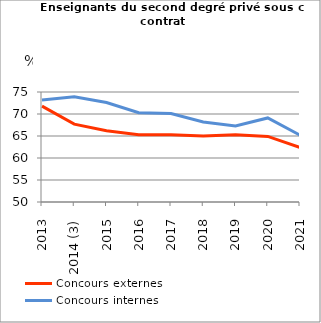
| Category | Concours externes  | Concours internes |
|---|---|---|
| 2013 | 71.8 | 73.2 |
| 2014 (3) | 67.7 | 73.9 |
| 2015 | 66.2 | 72.6 |
| 2016 | 65.3 | 70.3 |
| 2017 | 65.3 | 70.1 |
| 2018 | 65 | 68.2 |
| 2019 | 65.3 | 67.3 |
| 2020 | 64.9 | 69.1 |
| 2021 | 62.4 | 65.2 |